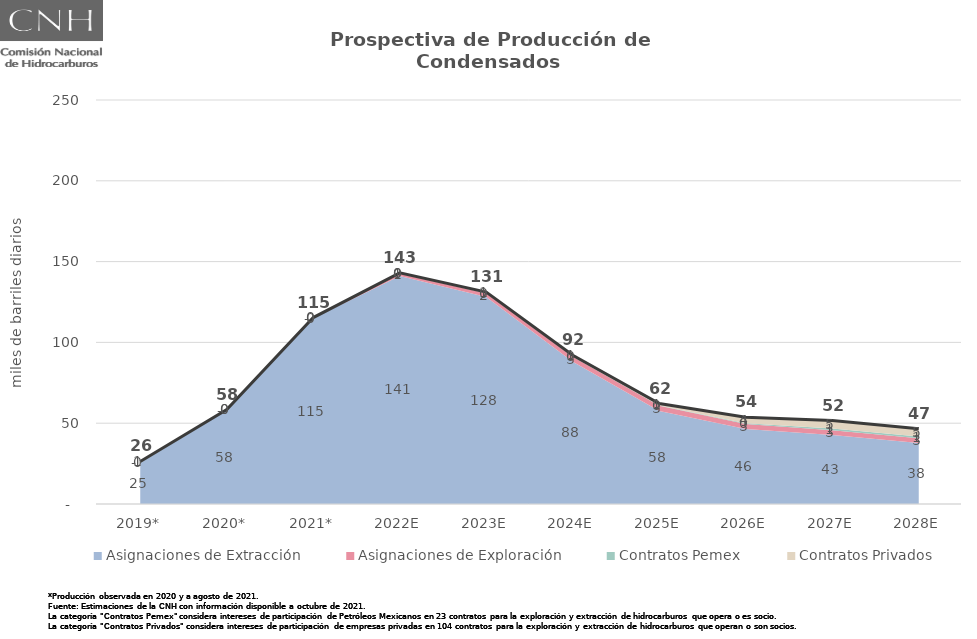
| Category | Total |
|---|---|
| 2019* | 26.35 |
| 2020* | 58.4 |
| 2021* | 115.364 |
| 2022E | 143.035 |
| 2023E | 131.133 |
| 2024E | 92.005 |
| 2025E | 62.171 |
| 2026E | 53.634 |
| 2027E | 51.61 |
| 2028E | 46.584 |